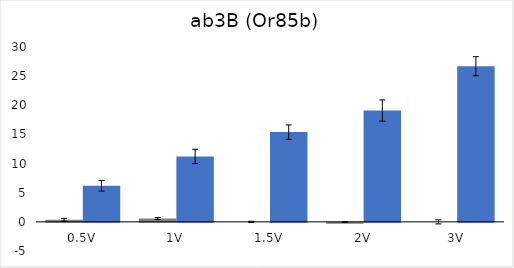
| Category | Series 0 | Series 1 |
|---|---|---|
| 0.5V | 0.36 | 6.18 |
| 1V | 0.57 | 11.23 |
| 1.5V | 0 | 15.4 |
| 2V | -0.14 | 19.1 |
| 3V | 0 | 26.7 |